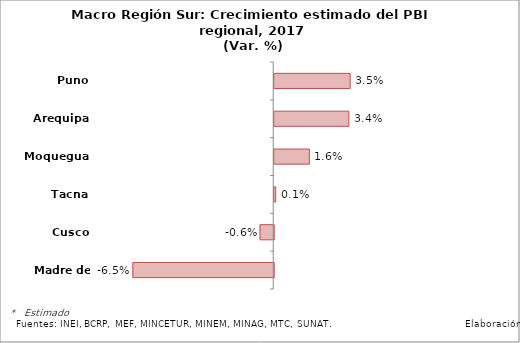
| Category | Series 0 |
|---|---|
| Puno | 0.035 |
| Arequipa | 0.034 |
| Moquegua | 0.016 |
| Tacna | 0.001 |
| Cusco | -0.006 |
| Madre de Dios | -0.065 |